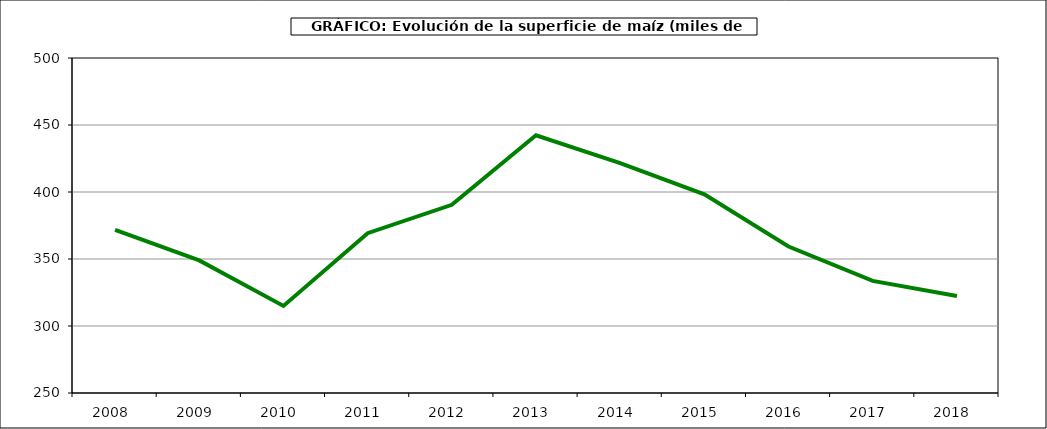
| Category | Superficie |
|---|---|
| 2008.0 | 371.732 |
| 2009.0 | 348.949 |
| 2010.0 | 314.99 |
| 2011.0 | 369.264 |
| 2012.0 | 390.433 |
| 2013.0 | 442.298 |
| 2014.0 | 421.605 |
| 2015.0 | 398.257 |
| 2016.0 | 359.275 |
| 2017.0 | 333.628 |
| 2018.0 | 322.373 |